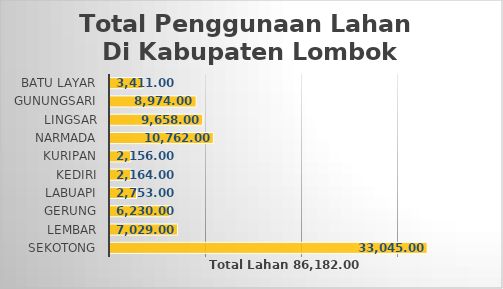
| Category | Series 0 |
|---|---|
| SEKOTONG | 33045 |
| LEMBAR | 7029 |
| GERUNG | 6230 |
| LABUAPI | 2753 |
|  KEDIRI | 2164 |
| KURIPAN | 2156 |
|  NARMADA | 10762 |
|  LINGSAR | 9658 |
|  GUNUNGSARI | 8974 |
|  BATU LAYAR | 3411 |